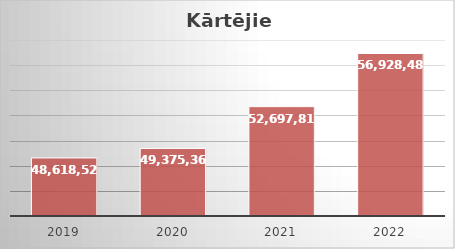
| Category | Series 0 |
|---|---|
| 2019.0 | 48618520 |
| 2020.0 | 49375368 |
| 2021.0 | 52697815 |
| 2022.0 | 56928484 |